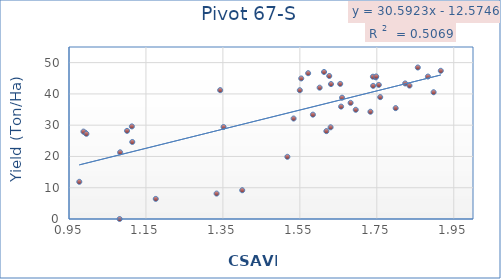
| Category | Series 0 |
|---|---|
| 1.601415 | 42 |
| 1.549899 | 41.17 |
| 1.747309 | 45.3 |
| 1.400183 | 9.2 |
| 1.175521 | 6.43 |
| 1.654855 | 43.2 |
| 1.740437 | 42.57 |
| 1.618918 | 28.1 |
| 1.856555 | 48.45 |
| 1.799037 | 35.45 |
| 0.991999 | 27.6 |
| 0.987577 | 27.95 |
| 1.100827 | 28.18 |
| 1.612857 | 47.01 |
| 1.758838 | 38.97 |
| 1.882872 | 45.55 |
| 1.916282 | 47.39 |
| 1.897628 | 40.53 |
| 1.755227 | 42.88 |
| 1.583921 | 33.37 |
| 1.082866 | 21.32 |
| 1.629936 | 29.32 |
| 1.733434 | 34.3 |
| 1.834957 | 42.66 |
| 1.681911 | 37.14 |
| 1.739886 | 45.5 |
| 1.626362 | 45.73 |
| 1.114472 | 24.63 |
| 1.657205 | 35.94 |
| 1.081605 | 0 |
| 1.55358 | 44.95 |
| 1.630957 | 43.14 |
| 1.695304 | 34.92 |
| 1.517556 | 19.89 |
| 1.571547 | 46.62 |
| 1.65966 | 38.79 |
| 1.748426 | 45.58 |
| 1.533759 | 32.13 |
| 0.995234 | 27.24 |
| 0.976747 | 11.89 |
| 1.342877 | 41.2 |
| 1.113411 | 29.61 |
| 1.823693 | 43.35 |
| 1.351742 | 29.42 |
| 1.333578 | 8.13 |